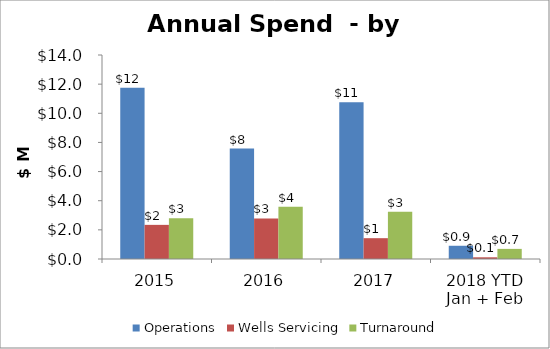
| Category | Operations | Wells Servicing | Turnaround |
|---|---|---|---|
| 2015 | 11747566 | 2342418 | 2801087 |
| 2016 | 7578731 | 2780334 | 3586352 |
| 2017 | 10749239.81 | 1428636.48 | 3234566.46 |
| 2018 YTD Jan + Feb | 907610.99 | 116434.79 | 694013.36 |